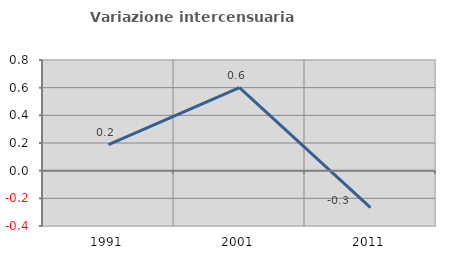
| Category | Variazione intercensuaria annua |
|---|---|
| 1991.0 | 0.189 |
| 2001.0 | 0.6 |
| 2011.0 | -0.267 |